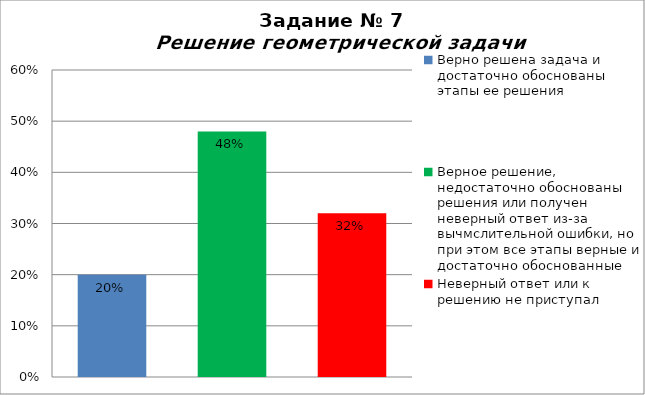
| Category | Решение геометрической задачи  |
|---|---|
| Верно решена задача и достаточно обоснованы этапы ее решения | 0.2 |
| Верное решение, недостаточно обоснованы решения или получен неверный ответ из-за вычмслительной ошибки, но при этом все этапы верные и достаточно обоснованные | 0.48 |
| Неверный ответ или к решению не приступал | 0.32 |